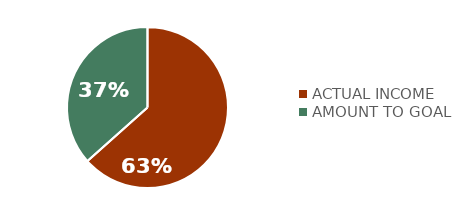
| Category | Series 0 |
|---|---|
| ACTUAL INCOME | 3170 |
| AMOUNT TO GOAL | 1830 |